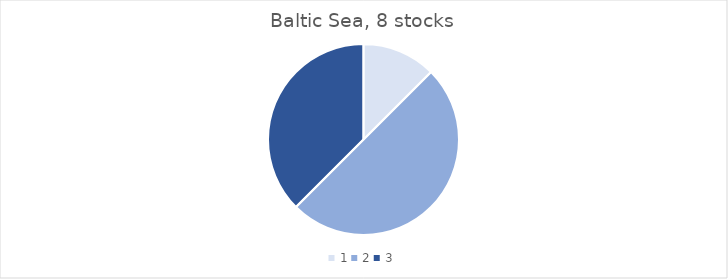
| Category | Baltic Sea |
|---|---|
| 0 | 1 |
| 1 | 4 |
| 2 | 3 |